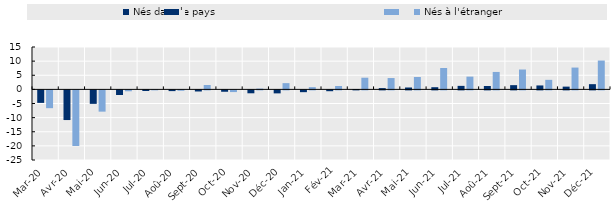
| Category | Nés dans le pays | Nés à l'étranger |
|---|---|---|
| mars-20 | -4.433 | -6.301 |
| Avr-20 | -10.505 | -19.685 |
| Mai-20 | -4.771 | -7.528 |
| juin-20 | -1.64 | -0.317 |
| juil-20 | -0.226 | 0.004 |
| Aoû-20 | -0.26 | -0.147 |
| sept-20 | -0.393 | 1.553 |
| oct-20 | -0.49 | -0.602 |
| nov-20 | -1.032 | 0.278 |
| Déc-20 | -1.062 | 2.209 |
| janv-21 | -0.634 | 0.792 |
| Fév-21 | -0.294 | 1.204 |
| mars-21 | 0.115 | 4.127 |
| Avr-21 | 0.445 | 4.011 |
| Mai-21 | 0.664 | 4.382 |
| juin-21 | 0.768 | 7.559 |
| juil-21 | 1.241 | 4.515 |
| Aoû-21 | 1.2 | 6.171 |
| sept-21 | 1.494 | 7.03 |
| oct-21 | 1.389 | 3.373 |
| nov-21 | 0.975 | 7.718 |
| Déc-21 | 1.844 | 10.207 |